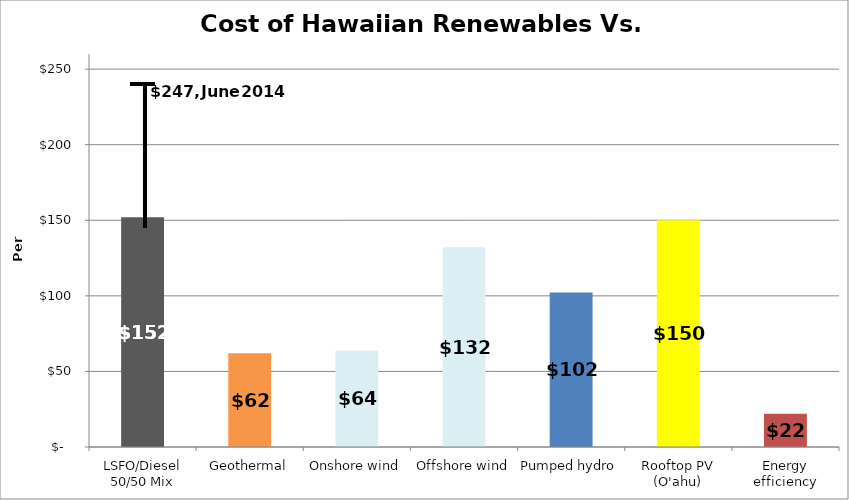
| Category | Series 0 |
|---|---|
| LSFO/Diesel 50/50 Mix | 152 |
| Geothermal | 62.058 |
| Onshore wind | 63.62 |
| Offshore wind | 132.223 |
| Pumped hydro | 102.145 |
| Rooftop PV (O'ahu) | 150 |
| Energy efficiency | 22 |